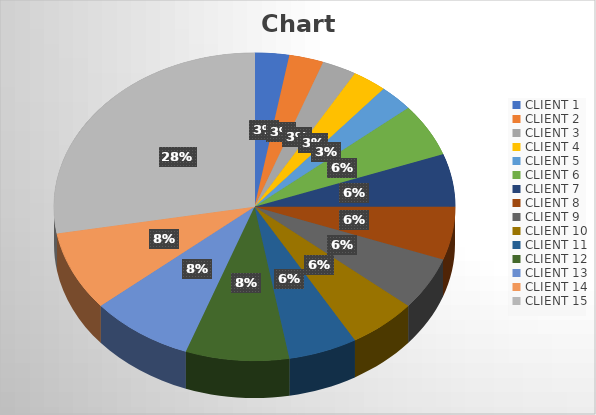
| Category | Series 0 |
|---|---|
| CLIENT 1 | 5 |
| CLIENT 2 | 5 |
| CLIENT 3 | 5 |
| CLIENT 4 | 5 |
| CLIENT 5 | 5 |
| CLIENT 6 | 10 |
| CLIENT 7 | 10 |
| CLIENT 8 | 10 |
| CLIENT 9 | 10 |
| CLIENT 10 | 10 |
| CLIENT 11 | 10 |
| CLIENT 12 | 15 |
| CLIENT 13 | 15 |
| CLIENT 14 | 15 |
| CLIENT 15 | 50 |